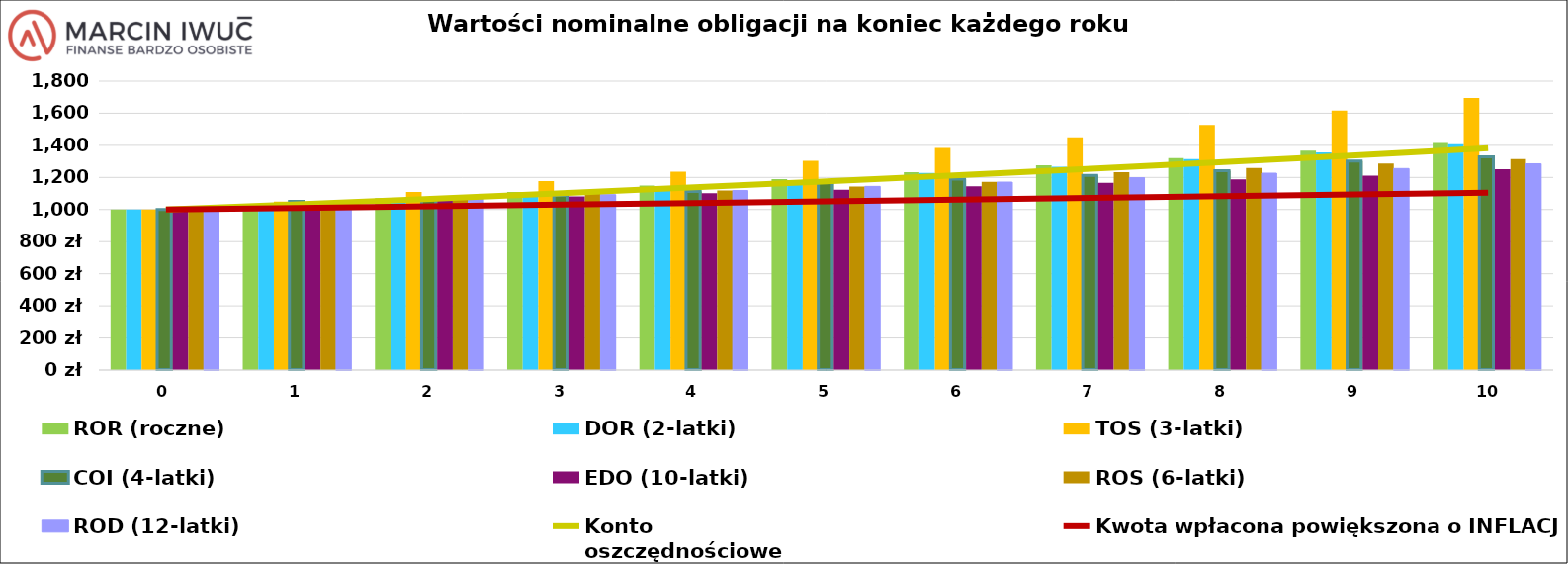
| Category | ROR (roczne) | DOR (2-latki) | TOS (3-latki) | COI (4-latki) | EDO (10-latki) | ROS (6-latki) | ROD (12-latki)  |
|---|---|---|---|---|---|---|---|
| 0.0 | 1000 | 1000 | 1000 | 1000 | 1000 | 1000 | 1000 |
| 1.0 | 1034.798 | 1029.95 | 1049.815 | 1051.03 | 1042.525 | 1052.65 | 1044.55 |
| 2.0 | 1071.772 | 1070.499 | 1109.101 | 1069.095 | 1062.071 | 1074.358 | 1068.496 |
| 3.0 | 1109.963 | 1103.8 | 1178.118 | 1087.753 | 1082.057 | 1096.609 | 1093.1 |
| 4.0 | 1149.41 | 1146.777 | 1236.619 | 1112.696 | 1102.493 | 1119.416 | 1118.38 |
| 5.0 | 1190.154 | 1182.587 | 1304.524 | 1168.464 | 1123.389 | 1142.793 | 1144.356 |
| 6.0 | 1232.238 | 1228.155 | 1383.222 | 1190.391 | 1144.755 | 1172.424 | 1171.047 |
| 7.0 | 1275.705 | 1266.641 | 1450.265 | 1213.039 | 1166.601 | 1232.721 | 1198.471 |
| 8.0 | 1320.603 | 1314.974 | 1527.672 | 1242.101 | 1188.939 | 1259.06 | 1226.65 |
| 9.0 | 1366.976 | 1356.315 | 1616.962 | 1302.125 | 1211.78 | 1286.077 | 1255.603 |
| 10.0 | 1414.875 | 1407.596 | 1695.284 | 1328.447 | 1251.334 | 1313.789 | 1285.352 |